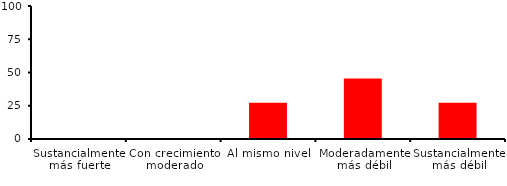
| Category | Series 0 |
|---|---|
| Sustancialmente más fuerte | 0 |
| Con crecimiento moderado | 0 |
| Al mismo nivel | 27.273 |
| Moderadamente más débil | 45.455 |
| Sustancialmente más débil | 27.273 |